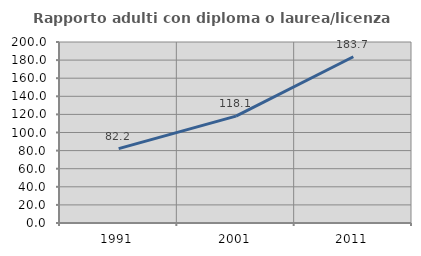
| Category | Rapporto adulti con diploma o laurea/licenza media  |
|---|---|
| 1991.0 | 82.152 |
| 2001.0 | 118.106 |
| 2011.0 | 183.683 |